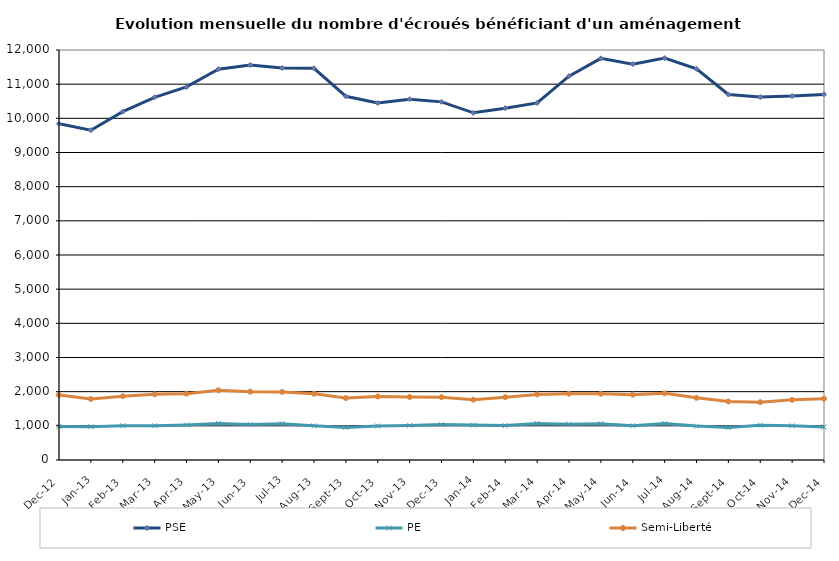
| Category | PSE | PE | Semi-Liberté |
|---|---|---|---|
| 2012-12-01 | 9840 | 984 | 1903 |
| 2013-01-01 | 9653 | 976 | 1785 |
| 2013-02-01 | 10197 | 1002 | 1867 |
| 2013-03-01 | 10615 | 1002 | 1921 |
| 2013-04-01 | 10919 | 1027 | 1942 |
| 2013-05-01 | 11438 | 1070 | 2041 |
| 2013-06-01 | 11559 | 1038 | 2000 |
| 2013-07-01 | 11475 | 1061 | 1993 |
| 2013-08-01 | 11465 | 999 | 1939 |
| 2013-09-01 | 10646 | 954 | 1813 |
| 2013-10-01 | 10451 | 993 | 1860 |
| 2013-11-01 | 10560 | 1013 | 1842 |
| 2013-12-01 | 10482 | 1037 | 1838 |
| 2014-01-01 | 10161 | 1022 | 1765 |
| 2014-02-01 | 10296 | 1007 | 1838 |
| 2014-03-01 | 10452 | 1071 | 1920 |
| 2014-04-01 | 11234 | 1050 | 1942 |
| 2014-05-01 | 11755 | 1062 | 1937 |
| 2014-06-01 | 11586 | 1005 | 1912 |
| 2014-07-01 | 11763 | 1068 | 1951 |
| 2014-08-01 | 11447 | 992 | 1820 |
| 2014-09-01 | 10698 | 951 | 1714 |
| 2014-10-01 | 10622 | 1018 | 1692 |
| 2014-11-01 | 10651 | 1000 | 1760 |
| 2014-12-01 | 10701 | 966 | 1794 |